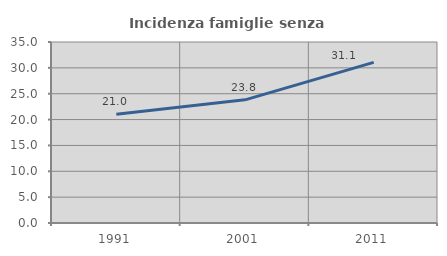
| Category | Incidenza famiglie senza nuclei |
|---|---|
| 1991.0 | 21.04 |
| 2001.0 | 23.811 |
| 2011.0 | 31.069 |